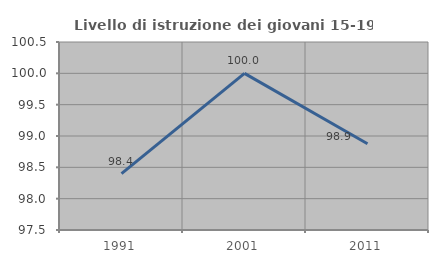
| Category | Livello di istruzione dei giovani 15-19 anni |
|---|---|
| 1991.0 | 98.4 |
| 2001.0 | 100 |
| 2011.0 | 98.876 |